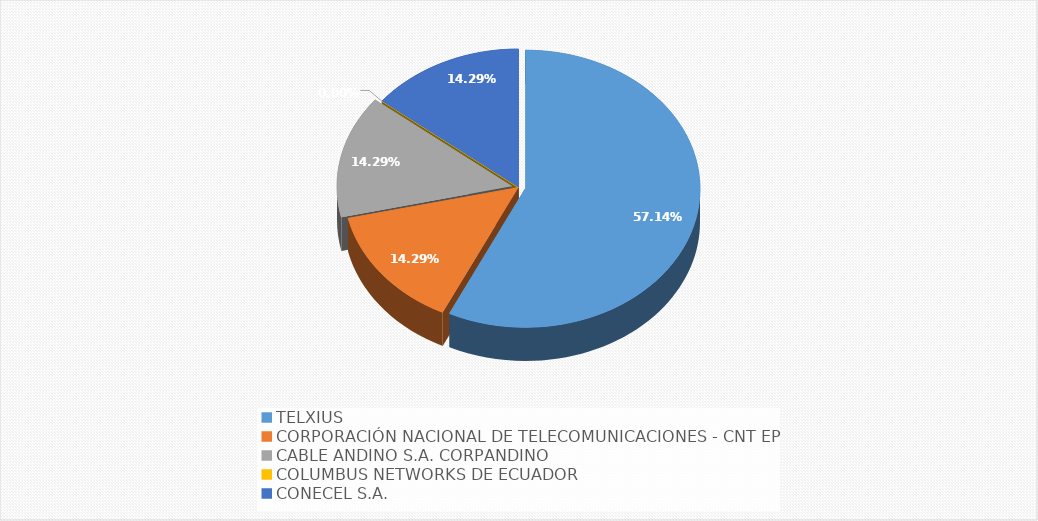
| Category | Series 0 |
|---|---|
| TELXIUS | 0.571 |
| CORPORACIÓN NACIONAL DE TELECOMUNICACIONES - CNT EP | 0.143 |
| CABLE ANDINO S.A. CORPANDINO | 0.143 |
| COLUMBUS NETWORKS DE ECUADOR | 0 |
| CONECEL S.A. | 0.143 |